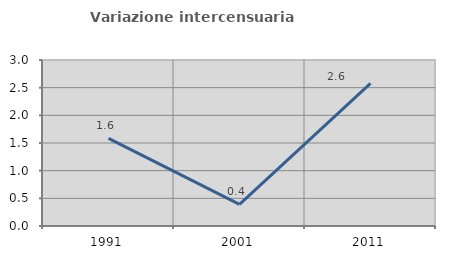
| Category | Variazione intercensuaria annua |
|---|---|
| 1991.0 | 1.584 |
| 2001.0 | 0.392 |
| 2011.0 | 2.577 |